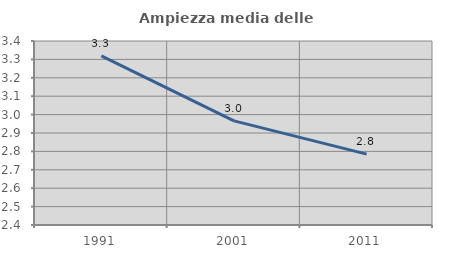
| Category | Ampiezza media delle famiglie |
|---|---|
| 1991.0 | 3.32 |
| 2001.0 | 2.966 |
| 2011.0 | 2.785 |